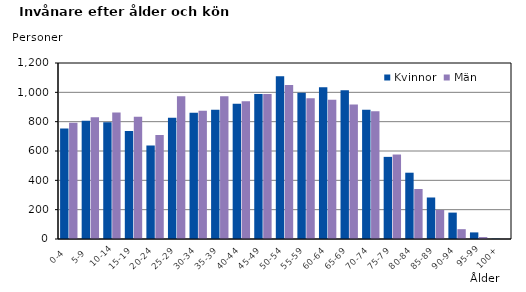
| Category | Kvinnor | Män |
|---|---|---|
|   0-4  | 753 | 793 |
|   5-9  | 807 | 830 |
| 10-14 | 796 | 863 |
| 15-19  | 736 | 833 |
| 20-24  | 637 | 709 |
| 25-29  | 826 | 974 |
| 30-34  | 860 | 874 |
| 35-39  | 882 | 974 |
| 40-44  | 923 | 940 |
| 45-49  | 989 | 988 |
| 50-54  | 1110 | 1050 |
| 55-59  | 998 | 959 |
| 60-64  | 1035 | 949 |
| 65-69  | 1014 | 917 |
| 70-74  | 881 | 871 |
| 75-79  | 560 | 576 |
| 80-84  | 452 | 341 |
| 85-89  | 283 | 198 |
| 90-94  | 180 | 67 |
| 95-99 | 45 | 13 |
| 100+ | 2 | 1 |